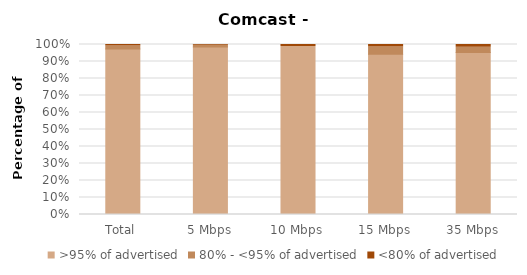
| Category | >95% of advertised | 80% - <95% of advertised | <80% of advertised |
|---|---|---|---|
| Total | 0.974 | 0.017 | 0.009 |
| 5 Mbps | 0.985 | 0.01 | 0.005 |
| 10 Mbps | 0.988 | 0 | 0.012 |
| 15 Mbps | 0.943 | 0.043 | 0.014 |
| 35 Mbps | 0.953 | 0.031 | 0.016 |